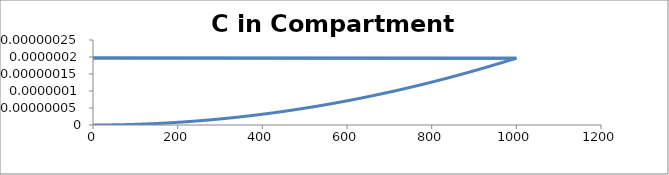
| Category | C - Sys 3 |
|---|---|
| 1.0 | 0 |
| 2.0 | 0 |
| 3.0 | 0 |
| 4.0 | 0 |
| 5.0 | 0 |
| 6.0 | 0 |
| 7.0 | 0 |
| 8.0 | 0 |
| 9.000000000000002 | 0 |
| 10.0 | 0 |
| 11.0 | 0 |
| 12.0 | 0 |
| 13.000000000000002 | 0 |
| 14.0 | 0 |
| 15.0 | 0 |
| 16.0 | 0 |
| 17.0 | 0 |
| 18.000000000000004 | 0 |
| 19.0 | 0 |
| 20.0 | 0 |
| 21.0 | 0 |
| 22.0 | 0 |
| 23.0 | 0 |
| 24.0 | 0 |
| 25.0 | 0 |
| 26.000000000000004 | 0 |
| 27.0 | 0 |
| 28.0 | 0 |
| 29.0 | 0 |
| 30.0 | 0 |
| 31.0 | 0 |
| 32.0 | 0 |
| 33.0 | 0 |
| 34.0 | 0 |
| 35.0 | 0 |
| 36.00000000000001 | 0 |
| 37.0 | 0 |
| 38.0 | 0 |
| 39.0 | 0 |
| 40.0 | 0 |
| 41.0 | 0 |
| 42.0 | 0 |
| 43.0 | 0 |
| 44.0 | 0 |
| 45.0 | 0 |
| 46.0 | 0 |
| 47.0 | 0 |
| 48.0 | 0 |
| 49.0 | 0 |
| 50.0 | 0 |
| 51.00000000000001 | 0 |
| 52.00000000000001 | 0 |
| 53.0 | 0 |
| 54.0 | 0 |
| 55.0 | 0 |
| 56.0 | 0 |
| 57.0 | 0 |
| 58.0 | 0 |
| 59.00000000000001 | 0 |
| 60.0 | 0 |
| 61.0 | 0 |
| 62.0 | 0 |
| 63.0 | 0 |
| 64.0 | 0 |
| 65.0 | 0 |
| 66.0 | 0 |
| 67.0 | 0 |
| 68.0 | 0 |
| 69.0 | 0 |
| 70.0 | 0 |
| 71.00000000000001 | 0 |
| 72.00000000000001 | 0 |
| 73.0 | 0 |
| 74.0 | 0 |
| 75.0 | 0 |
| 76.0 | 0 |
| 77.0 | 0 |
| 78.0 | 0 |
| 79.0 | 0 |
| 80.0 | 0 |
| 81.0 | 0 |
| 82.0 | 0 |
| 83.0 | 0 |
| 84.0 | 0 |
| 85.0 | 0 |
| 86.0 | 0 |
| 87.00000000000001 | 0 |
| 88.0 | 0 |
| 89.0 | 0 |
| 90.0 | 0 |
| 91.0 | 0 |
| 92.0 | 0 |
| 93.0 | 0 |
| 94.0 | 0 |
| 95.0 | 0 |
| 96.0 | 0 |
| 97.0 | 0 |
| 98.0 | 0 |
| 99.0 | 0 |
| 100.0 | 0 |
| 101.0 | 0 |
| 102.00000000000001 | 0 |
| 103.00000000000001 | 0 |
| 104.00000000000001 | 0 |
| 105.0 | 0 |
| 106.0 | 0 |
| 107.0 | 0 |
| 108.0 | 0 |
| 109.0 | 0 |
| 110.0 | 0 |
| 111.0 | 0 |
| 112.0 | 0 |
| 113.0 | 0 |
| 114.0 | 0 |
| 115.0 | 0 |
| 116.0 | 0 |
| 117.0 | 0 |
| 118.00000000000001 | 0 |
| 119.00000000000001 | 0 |
| 120.0 | 0 |
| 121.0 | 0 |
| 122.0 | 0 |
| 123.0 | 0 |
| 124.0 | 0 |
| 125.0 | 0 |
| 126.0 | 0 |
| 127.0 | 0 |
| 128.0 | 0 |
| 129.0 | 0 |
| 130.0 | 0 |
| 131.0 | 0 |
| 132.0 | 0 |
| 133.0 | 0 |
| 134.0 | 0 |
| 135.0 | 0 |
| 136.0 | 0 |
| 137.0 | 0 |
| 138.0 | 0 |
| 139.0 | 0 |
| 140.0 | 0 |
| 141.0 | 0 |
| 142.00000000000003 | 0 |
| 143.00000000000003 | 0 |
| 144.00000000000003 | 0 |
| 145.0 | 0 |
| 146.0 | 0 |
| 147.0 | 0 |
| 148.0 | 0 |
| 149.0 | 0 |
| 150.0 | 0 |
| 151.0 | 0 |
| 152.0 | 0 |
| 153.0 | 0 |
| 154.0 | 0 |
| 155.0 | 0 |
| 156.0 | 0 |
| 157.0 | 0 |
| 158.0 | 0 |
| 159.0 | 0 |
| 160.0 | 0 |
| 161.0 | 0 |
| 162.0 | 0 |
| 163.0 | 0 |
| 164.0 | 0 |
| 165.0 | 0 |
| 166.0 | 0 |
| 167.0 | 0 |
| 168.0 | 0 |
| 169.0 | 0 |
| 170.0 | 0 |
| 171.0 | 0 |
| 172.0 | 0 |
| 173.00000000000003 | 0 |
| 174.00000000000003 | 0 |
| 175.00000000000003 | 0 |
| 176.0 | 0 |
| 177.0 | 0 |
| 178.0 | 0 |
| 179.0 | 0 |
| 180.0 | 0 |
| 181.0 | 0 |
| 182.0 | 0 |
| 183.0 | 0 |
| 184.0 | 0 |
| 185.0 | 0 |
| 186.0 | 0 |
| 187.0 | 0 |
| 188.0 | 0 |
| 189.0 | 0 |
| 190.0 | 0 |
| 191.0 | 0 |
| 192.0 | 0 |
| 193.0 | 0 |
| 194.0 | 0 |
| 195.0 | 0 |
| 196.0 | 0 |
| 197.0 | 0 |
| 198.0 | 0 |
| 199.0 | 0 |
| 200.0 | 0 |
| 201.0 | 0 |
| 202.0 | 0 |
| 203.0 | 0 |
| 204.00000000000003 | 0 |
| 205.00000000000003 | 0 |
| 206.00000000000003 | 0 |
| 207.00000000000003 | 0 |
| 208.00000000000003 | 0 |
| 209.0 | 0 |
| 210.0 | 0 |
| 211.0 | 0 |
| 212.0 | 0 |
| 213.0 | 0 |
| 214.0 | 0 |
| 215.0 | 0 |
| 216.0 | 0 |
| 217.0 | 0 |
| 218.0 | 0 |
| 219.0 | 0 |
| 220.0 | 0 |
| 221.0 | 0 |
| 222.0 | 0 |
| 223.0 | 0 |
| 224.0 | 0 |
| 225.0 | 0 |
| 226.0 | 0 |
| 227.0 | 0 |
| 228.0 | 0 |
| 229.0 | 0 |
| 230.0 | 0 |
| 231.0 | 0 |
| 232.0 | 0 |
| 233.0 | 0 |
| 234.0 | 0 |
| 235.00000000000003 | 0 |
| 236.00000000000003 | 0 |
| 237.00000000000003 | 0 |
| 238.00000000000003 | 0 |
| 239.00000000000003 | 0 |
| 240.0 | 0 |
| 241.0 | 0 |
| 242.0 | 0 |
| 243.0 | 0 |
| 244.0 | 0 |
| 245.0 | 0 |
| 246.0 | 0 |
| 247.0 | 0 |
| 248.0 | 0 |
| 249.0 | 0 |
| 250.0 | 0 |
| 251.0 | 0 |
| 252.0 | 0 |
| 253.0 | 0 |
| 254.0 | 0 |
| 255.0 | 0 |
| 256.0 | 0 |
| 257.0 | 0 |
| 258.0 | 0 |
| 259.0 | 0 |
| 260.0 | 0 |
| 261.0 | 0 |
| 262.0 | 0 |
| 263.0 | 0 |
| 264.0 | 0 |
| 265.0 | 0 |
| 266.0 | 0 |
| 267.0 | 0 |
| 268.0 | 0 |
| 269.0 | 0 |
| 270.0 | 0 |
| 271.0 | 0 |
| 272.0 | 0 |
| 273.0 | 0 |
| 274.0 | 0 |
| 275.0 | 0 |
| 276.0 | 0 |
| 277.0 | 0 |
| 278.0 | 0 |
| 279.0 | 0 |
| 280.0 | 0 |
| 281.0 | 0 |
| 282.0 | 0 |
| 283.00000000000006 | 0 |
| 284.00000000000006 | 0 |
| 285.00000000000006 | 0 |
| 286.00000000000006 | 0 |
| 287.00000000000006 | 0 |
| 288.00000000000006 | 0 |
| 289.0 | 0 |
| 290.0 | 0 |
| 291.0 | 0 |
| 292.0 | 0 |
| 293.0 | 0 |
| 294.0 | 0 |
| 295.0 | 0 |
| 296.0 | 0 |
| 297.0 | 0 |
| 298.0 | 0 |
| 299.0 | 0 |
| 300.0 | 0 |
| 301.0 | 0 |
| 302.0 | 0 |
| 303.0 | 0 |
| 304.0 | 0 |
| 305.0 | 0 |
| 306.0 | 0 |
| 307.0 | 0 |
| 308.0 | 0 |
| 309.0 | 0 |
| 310.0 | 0 |
| 311.0 | 0 |
| 312.0 | 0 |
| 313.0 | 0 |
| 314.0 | 0 |
| 315.0 | 0 |
| 316.0 | 0 |
| 317.0 | 0 |
| 318.0 | 0 |
| 319.0 | 0 |
| 320.0 | 0 |
| 321.0 | 0 |
| 322.0 | 0 |
| 323.0 | 0 |
| 324.0 | 0 |
| 325.0 | 0 |
| 326.0 | 0 |
| 327.0 | 0 |
| 328.0 | 0 |
| 329.0 | 0 |
| 330.0 | 0 |
| 331.0 | 0 |
| 332.0 | 0 |
| 333.0 | 0 |
| 334.0 | 0 |
| 335.0 | 0 |
| 336.0 | 0 |
| 337.0 | 0 |
| 338.0 | 0 |
| 339.0 | 0 |
| 340.0 | 0 |
| 341.0 | 0 |
| 342.0 | 0 |
| 343.0 | 0 |
| 344.0 | 0 |
| 345.00000000000006 | 0 |
| 346.00000000000006 | 0 |
| 347.00000000000006 | 0 |
| 348.00000000000006 | 0 |
| 349.00000000000006 | 0 |
| 350.00000000000006 | 0 |
| 351.00000000000006 | 0 |
| 352.0 | 0 |
| 353.0 | 0 |
| 354.0 | 0 |
| 355.0 | 0 |
| 356.0 | 0 |
| 357.0 | 0 |
| 358.0 | 0 |
| 359.0 | 0 |
| 360.0 | 0 |
| 361.0 | 0 |
| 362.0 | 0 |
| 363.0 | 0 |
| 364.0 | 0 |
| 365.0 | 0 |
| 366.0 | 0 |
| 367.0 | 0 |
| 368.0 | 0 |
| 369.0 | 0 |
| 370.0 | 0 |
| 371.0 | 0 |
| 372.0 | 0 |
| 373.0 | 0 |
| 374.0 | 0 |
| 375.0 | 0 |
| 376.0 | 0 |
| 377.0 | 0 |
| 378.0 | 0 |
| 379.0 | 0 |
| 380.0 | 0 |
| 381.0 | 0 |
| 382.0 | 0 |
| 383.0 | 0 |
| 384.0 | 0 |
| 385.0 | 0 |
| 386.0 | 0 |
| 387.0 | 0 |
| 388.0 | 0 |
| 389.0 | 0 |
| 390.0 | 0 |
| 391.0 | 0 |
| 392.0 | 0 |
| 393.0 | 0 |
| 394.0 | 0 |
| 395.0 | 0 |
| 396.0 | 0 |
| 397.0 | 0 |
| 398.0 | 0 |
| 399.0 | 0 |
| 400.0 | 0 |
| 401.0 | 0 |
| 402.0 | 0 |
| 403.0 | 0 |
| 404.0 | 0 |
| 405.0 | 0 |
| 406.0 | 0 |
| 407.0 | 0 |
| 408.00000000000006 | 0 |
| 409.00000000000006 | 0 |
| 410.00000000000006 | 0 |
| 411.00000000000006 | 0 |
| 412.00000000000006 | 0 |
| 413.00000000000006 | 0 |
| 414.00000000000006 | 0 |
| 415.00000000000006 | 0 |
| 416.00000000000006 | 0 |
| 417.0 | 0 |
| 418.0 | 0 |
| 419.0 | 0 |
| 420.0 | 0 |
| 421.0 | 0 |
| 422.0 | 0 |
| 423.0 | 0 |
| 424.0 | 0 |
| 425.0 | 0 |
| 426.0 | 0 |
| 427.0 | 0 |
| 428.0 | 0 |
| 429.0 | 0 |
| 430.0 | 0 |
| 431.0 | 0 |
| 432.0 | 0 |
| 433.0 | 0 |
| 434.0 | 0 |
| 435.0 | 0 |
| 436.0 | 0 |
| 437.0 | 0 |
| 438.0 | 0 |
| 439.0 | 0 |
| 440.0 | 0 |
| 441.0 | 0 |
| 442.0 | 0 |
| 443.0 | 0 |
| 444.0 | 0 |
| 445.0 | 0 |
| 446.0 | 0 |
| 447.0 | 0 |
| 448.0 | 0 |
| 449.0 | 0 |
| 450.0 | 0 |
| 451.0 | 0 |
| 452.0 | 0 |
| 453.0 | 0 |
| 454.0 | 0 |
| 455.0 | 0 |
| 456.0 | 0 |
| 457.0 | 0 |
| 458.0 | 0 |
| 459.0 | 0 |
| 460.0 | 0 |
| 461.0 | 0 |
| 462.0 | 0 |
| 463.0 | 0 |
| 464.0 | 0 |
| 465.0 | 0 |
| 466.0 | 0 |
| 467.0 | 0 |
| 468.0 | 0 |
| 469.0 | 0 |
| 470.00000000000006 | 0 |
| 471.00000000000006 | 0 |
| 472.00000000000006 | 0 |
| 473.00000000000006 | 0 |
| 474.00000000000006 | 0 |
| 475.00000000000006 | 0 |
| 476.00000000000006 | 0 |
| 477.00000000000006 | 0 |
| 478.00000000000006 | 0 |
| 479.00000000000006 | 0 |
| 480.0 | 0 |
| 481.0 | 0 |
| 482.0 | 0 |
| 483.0 | 0 |
| 484.0 | 0 |
| 485.0 | 0 |
| 486.0 | 0 |
| 487.0 | 0 |
| 488.0 | 0 |
| 489.0 | 0 |
| 490.0 | 0 |
| 491.0 | 0 |
| 492.0 | 0 |
| 493.0 | 0 |
| 494.0 | 0 |
| 495.0 | 0 |
| 496.0 | 0 |
| 497.0 | 0 |
| 498.0 | 0 |
| 499.0 | 0 |
| 500.0 | 0 |
| 501.0 | 0 |
| 502.0 | 0 |
| 503.0 | 0 |
| 504.0 | 0 |
| 505.0 | 0 |
| 506.0 | 0 |
| 507.0 | 0 |
| 508.0 | 0 |
| 509.0 | 0 |
| 510.0 | 0 |
| 511.0 | 0 |
| 512.0 | 0 |
| 513.0 | 0 |
| 514.0 | 0 |
| 515.0 | 0 |
| 516.0 | 0 |
| 517.0 | 0 |
| 518.0 | 0 |
| 519.0 | 0 |
| 520.0 | 0 |
| 521.0 | 0 |
| 522.0 | 0 |
| 523.0 | 0 |
| 524.0 | 0 |
| 525.0 | 0 |
| 526.0 | 0 |
| 527.0 | 0 |
| 528.0 | 0 |
| 529.0 | 0 |
| 530.0 | 0 |
| 531.0 | 0 |
| 532.0 | 0 |
| 533.0 | 0 |
| 534.0 | 0 |
| 535.0 | 0 |
| 536.0 | 0 |
| 537.0 | 0 |
| 538.0 | 0 |
| 539.0 | 0 |
| 540.0 | 0 |
| 541.0 | 0 |
| 542.0 | 0 |
| 543.0 | 0 |
| 544.0 | 0 |
| 545.0 | 0 |
| 546.0 | 0 |
| 547.0 | 0 |
| 548.0 | 0 |
| 549.0 | 0 |
| 550.0 | 0 |
| 551.0 | 0 |
| 552.0 | 0 |
| 553.0 | 0 |
| 554.0 | 0 |
| 555.0 | 0 |
| 556.0 | 0 |
| 557.0 | 0 |
| 558.0 | 0 |
| 559.0 | 0 |
| 560.0 | 0 |
| 561.0 | 0 |
| 562.0 | 0 |
| 563.0 | 0 |
| 564.0 | 0 |
| 565.0000000000001 | 0 |
| 566.0000000000001 | 0 |
| 567.0000000000001 | 0 |
| 568.0000000000001 | 0 |
| 569.0000000000001 | 0 |
| 570.0000000000001 | 0 |
| 571.0000000000001 | 0 |
| 572.0000000000001 | 0 |
| 573.0000000000001 | 0 |
| 574.0000000000001 | 0 |
| 575.0000000000001 | 0 |
| 576.0000000000001 | 0 |
| 577.0 | 0 |
| 578.0 | 0 |
| 579.0 | 0 |
| 580.0 | 0 |
| 581.0 | 0 |
| 582.0 | 0 |
| 583.0 | 0 |
| 584.0 | 0 |
| 585.0 | 0 |
| 586.0 | 0 |
| 587.0 | 0 |
| 588.0 | 0 |
| 589.0 | 0 |
| 590.0 | 0 |
| 591.0 | 0 |
| 592.0 | 0 |
| 593.0 | 0 |
| 594.0 | 0 |
| 595.0 | 0 |
| 596.0 | 0 |
| 597.0 | 0 |
| 598.0 | 0 |
| 599.0 | 0 |
| 600.0 | 0 |
| 601.0 | 0 |
| 602.0 | 0 |
| 603.0 | 0 |
| 604.0 | 0 |
| 605.0 | 0 |
| 606.0 | 0 |
| 607.0 | 0 |
| 608.0 | 0 |
| 609.0 | 0 |
| 610.0 | 0 |
| 611.0 | 0 |
| 612.0 | 0 |
| 613.0 | 0 |
| 614.0 | 0 |
| 615.0 | 0 |
| 616.0 | 0 |
| 617.0 | 0 |
| 618.0 | 0 |
| 619.0 | 0 |
| 620.0 | 0 |
| 621.0 | 0 |
| 622.0 | 0 |
| 623.0 | 0 |
| 624.0 | 0 |
| 625.0 | 0 |
| 626.0 | 0 |
| 627.0 | 0 |
| 628.0 | 0 |
| 629.0 | 0 |
| 630.0 | 0 |
| 631.0 | 0 |
| 632.0 | 0 |
| 633.0 | 0 |
| 634.0 | 0 |
| 635.0 | 0 |
| 636.0 | 0 |
| 637.0 | 0 |
| 638.0 | 0 |
| 639.0 | 0 |
| 640.0 | 0 |
| 641.0 | 0 |
| 642.0 | 0 |
| 643.0 | 0 |
| 644.0 | 0 |
| 645.0 | 0 |
| 646.0 | 0 |
| 647.0 | 0 |
| 648.0 | 0 |
| 649.0 | 0 |
| 650.0 | 0 |
| 651.0 | 0 |
| 652.0 | 0 |
| 653.0 | 0 |
| 654.0 | 0 |
| 655.0 | 0 |
| 656.0 | 0 |
| 657.0 | 0 |
| 658.0 | 0 |
| 659.0 | 0 |
| 660.0 | 0 |
| 661.0 | 0 |
| 662.0 | 0 |
| 663.0 | 0 |
| 664.0 | 0 |
| 665.0 | 0 |
| 666.0 | 0 |
| 667.0 | 0 |
| 668.0 | 0 |
| 669.0 | 0 |
| 670.0 | 0 |
| 671.0 | 0 |
| 672.0 | 0 |
| 673.0 | 0 |
| 674.0 | 0 |
| 675.0 | 0 |
| 676.0 | 0 |
| 677.0 | 0 |
| 678.0 | 0 |
| 679.0 | 0 |
| 680.0 | 0 |
| 681.0 | 0 |
| 682.0 | 0 |
| 683.0 | 0 |
| 684.0 | 0 |
| 685.0 | 0 |
| 686.0 | 0 |
| 687.0 | 0 |
| 688.0 | 0 |
| 689.0 | 0 |
| 690.0000000000001 | 0 |
| 691.0000000000001 | 0 |
| 692.0000000000001 | 0 |
| 693.0000000000001 | 0 |
| 694.0000000000001 | 0 |
| 695.0000000000001 | 0 |
| 696.0000000000001 | 0 |
| 697.0000000000001 | 0 |
| 698.0000000000001 | 0 |
| 699.0000000000001 | 0 |
| 700.0000000000001 | 0 |
| 701.0000000000001 | 0 |
| 702.0000000000001 | 0 |
| 703.0000000000001 | 0 |
| 704.0 | 0 |
| 705.0 | 0 |
| 706.0 | 0 |
| 707.0 | 0 |
| 708.0 | 0 |
| 709.0 | 0 |
| 710.0 | 0 |
| 711.0 | 0 |
| 712.0 | 0 |
| 713.0 | 0 |
| 714.0 | 0 |
| 715.0 | 0 |
| 716.0 | 0 |
| 717.0 | 0 |
| 718.0 | 0 |
| 719.0 | 0 |
| 720.0 | 0 |
| 721.0 | 0 |
| 722.0 | 0 |
| 723.0 | 0 |
| 724.0 | 0 |
| 725.0 | 0 |
| 726.0 | 0 |
| 727.0 | 0 |
| 728.0 | 0 |
| 729.0 | 0 |
| 730.0 | 0 |
| 731.0 | 0 |
| 732.0 | 0 |
| 733.0 | 0 |
| 734.0 | 0 |
| 735.0 | 0 |
| 736.0 | 0 |
| 737.0 | 0 |
| 738.0 | 0 |
| 739.0 | 0 |
| 740.0 | 0 |
| 741.0 | 0 |
| 742.0 | 0 |
| 743.0 | 0 |
| 744.0 | 0 |
| 745.0 | 0 |
| 746.0 | 0 |
| 747.0 | 0 |
| 748.0 | 0 |
| 749.0 | 0 |
| 750.0 | 0 |
| 751.0 | 0 |
| 752.0 | 0 |
| 753.0 | 0 |
| 754.0 | 0 |
| 755.0 | 0 |
| 756.0 | 0 |
| 757.0 | 0 |
| 758.0 | 0 |
| 759.0 | 0 |
| 760.0 | 0 |
| 761.0 | 0 |
| 762.0 | 0 |
| 763.0 | 0 |
| 764.0 | 0 |
| 765.0 | 0 |
| 766.0 | 0 |
| 767.0 | 0 |
| 768.0 | 0 |
| 769.0 | 0 |
| 770.0 | 0 |
| 771.0 | 0 |
| 772.0 | 0 |
| 773.0 | 0 |
| 774.0 | 0 |
| 775.0 | 0 |
| 776.0 | 0 |
| 777.0 | 0 |
| 778.0 | 0 |
| 779.0 | 0 |
| 780.0 | 0 |
| 781.0 | 0 |
| 782.0 | 0 |
| 783.0 | 0 |
| 784.0 | 0 |
| 785.0 | 0 |
| 786.0 | 0 |
| 787.0 | 0 |
| 788.0 | 0 |
| 789.0 | 0 |
| 790.0 | 0 |
| 791.0 | 0 |
| 792.0 | 0 |
| 793.0 | 0 |
| 794.0 | 0 |
| 795.0 | 0 |
| 796.0 | 0 |
| 797.0 | 0 |
| 798.0 | 0 |
| 799.0 | 0 |
| 800.0 | 0 |
| 801.0 | 0 |
| 802.0 | 0 |
| 803.0 | 0 |
| 804.0 | 0 |
| 805.0 | 0 |
| 806.0 | 0 |
| 807.0 | 0 |
| 808.0 | 0 |
| 809.0 | 0 |
| 810.0 | 0 |
| 811.0 | 0 |
| 812.0 | 0 |
| 813.0 | 0 |
| 814.0 | 0 |
| 815.0000000000001 | 0 |
| 816.0000000000001 | 0 |
| 817.0000000000001 | 0 |
| 818.0000000000001 | 0 |
| 819.0000000000001 | 0 |
| 820.0000000000001 | 0 |
| 821.0000000000001 | 0 |
| 822.0000000000001 | 0 |
| 823.0000000000001 | 0 |
| 824.0000000000001 | 0 |
| 825.0000000000001 | 0 |
| 826.0000000000001 | 0 |
| 827.0000000000001 | 0 |
| 828.0000000000001 | 0 |
| 829.0000000000001 | 0 |
| 830.0000000000001 | 0 |
| 831.0000000000001 | 0 |
| 832.0000000000001 | 0 |
| 833.0 | 0 |
| 834.0 | 0 |
| 835.0 | 0 |
| 836.0 | 0 |
| 837.0 | 0 |
| 838.0 | 0 |
| 839.0 | 0 |
| 840.0 | 0 |
| 841.0 | 0 |
| 842.0 | 0 |
| 843.0 | 0 |
| 844.0 | 0 |
| 845.0 | 0 |
| 846.0 | 0 |
| 847.0 | 0 |
| 848.0 | 0 |
| 849.0 | 0 |
| 850.0 | 0 |
| 851.0 | 0 |
| 852.0 | 0 |
| 853.0 | 0 |
| 854.0 | 0 |
| 855.0 | 0 |
| 856.0 | 0 |
| 857.0 | 0 |
| 858.0 | 0 |
| 859.0 | 0 |
| 860.0 | 0 |
| 861.0 | 0 |
| 862.0 | 0 |
| 863.0 | 0 |
| 864.0 | 0 |
| 865.0 | 0 |
| 866.0 | 0 |
| 867.0 | 0 |
| 868.0 | 0 |
| 869.0 | 0 |
| 870.0 | 0 |
| 871.0 | 0 |
| 872.0 | 0 |
| 873.0 | 0 |
| 874.0 | 0 |
| 875.0 | 0 |
| 876.0 | 0 |
| 877.0 | 0 |
| 878.0 | 0 |
| 879.0 | 0 |
| 880.0 | 0 |
| 881.0 | 0 |
| 882.0 | 0 |
| 883.0 | 0 |
| 884.0 | 0 |
| 885.0 | 0 |
| 886.0 | 0 |
| 887.0 | 0 |
| 888.0 | 0 |
| 889.0 | 0 |
| 890.0 | 0 |
| 891.0 | 0 |
| 892.0 | 0 |
| 893.0 | 0 |
| 894.0 | 0 |
| 895.0 | 0 |
| 896.0 | 0 |
| 897.0 | 0 |
| 898.0 | 0 |
| 899.0 | 0 |
| 900.0 | 0 |
| 901.0 | 0 |
| 902.0 | 0 |
| 903.0 | 0 |
| 904.0 | 0 |
| 905.0 | 0 |
| 906.0 | 0 |
| 907.0 | 0 |
| 908.0 | 0 |
| 909.0 | 0 |
| 910.0 | 0 |
| 911.0 | 0 |
| 912.0 | 0 |
| 913.0 | 0 |
| 914.0 | 0 |
| 915.0 | 0 |
| 916.0 | 0 |
| 917.0 | 0 |
| 918.0 | 0 |
| 919.0 | 0 |
| 920.0 | 0 |
| 921.0 | 0 |
| 922.0 | 0 |
| 923.0 | 0 |
| 924.0 | 0 |
| 925.0 | 0 |
| 926.0 | 0 |
| 927.0 | 0 |
| 928.0 | 0 |
| 929.0 | 0 |
| 930.0 | 0 |
| 931.0 | 0 |
| 932.0 | 0 |
| 933.0 | 0 |
| 934.0 | 0 |
| 935.0 | 0 |
| 936.0 | 0 |
| 937.0 | 0 |
| 938.0 | 0 |
| 939.0 | 0 |
| 940.0000000000001 | 0 |
| 941.0000000000001 | 0 |
| 942.0000000000001 | 0 |
| 943.0000000000001 | 0 |
| 944.0000000000001 | 0 |
| 945.0000000000001 | 0 |
| 946.0000000000001 | 0 |
| 947.0000000000001 | 0 |
| 948.0000000000001 | 0 |
| 949.0000000000001 | 0 |
| 950.0000000000001 | 0 |
| 951.0000000000001 | 0 |
| 952.0000000000001 | 0 |
| 953.0000000000001 | 0 |
| 954.0000000000001 | 0 |
| 955.0000000000001 | 0 |
| 956.0000000000001 | 0 |
| 957.0000000000001 | 0 |
| 958.0000000000001 | 0 |
| 959.0000000000001 | 0 |
| 960.0 | 0 |
| 961.0 | 0 |
| 962.0 | 0 |
| 963.0 | 0 |
| 964.0 | 0 |
| 965.0 | 0 |
| 966.0 | 0 |
| 967.0 | 0 |
| 968.0 | 0 |
| 969.0 | 0 |
| 970.0 | 0 |
| 971.0 | 0 |
| 972.0 | 0 |
| 973.0 | 0 |
| 974.0 | 0 |
| 975.0 | 0 |
| 976.0 | 0 |
| 977.0 | 0 |
| 978.0 | 0 |
| 979.0 | 0 |
| 980.0 | 0 |
| 981.0 | 0 |
| 982.0 | 0 |
| 983.0 | 0 |
| 984.0 | 0 |
| 985.0 | 0 |
| 986.0 | 0 |
| 987.0 | 0 |
| 988.0 | 0 |
| 989.0 | 0 |
| 990.0 | 0 |
| 991.0 | 0 |
| 992.0 | 0 |
| 993.0 | 0 |
| 994.0 | 0 |
| 995.0 | 0 |
| 996.0 | 0 |
| 997.0 | 0 |
| 998.0 | 0 |
| 999.0 | 0 |
| 1000.0 | 0 |